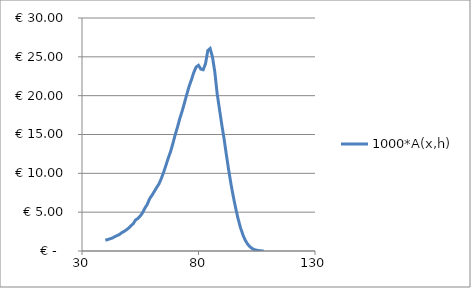
| Category | 1000*A(x,h) |
|---|---|
| 40.0 | 1.397 |
| 41.0 | 1.464 |
| 42.0 | 1.569 |
| 43.0 | 1.673 |
| 44.0 | 1.832 |
| 45.0 | 1.979 |
| 46.0 | 2.113 |
| 47.0 | 2.349 |
| 48.0 | 2.514 |
| 49.0 | 2.713 |
| 50.0 | 2.945 |
| 51.0 | 3.236 |
| 52.0 | 3.52 |
| 53.0 | 3.996 |
| 54.0 | 4.187 |
| 55.0 | 4.506 |
| 56.0 | 4.931 |
| 57.0 | 5.528 |
| 58.0 | 6.002 |
| 59.0 | 6.719 |
| 60.0 | 7.154 |
| 61.0 | 7.645 |
| 62.0 | 8.16 |
| 63.0 | 8.614 |
| 64.0 | 9.3 |
| 65.0 | 10.106 |
| 66.0 | 11.014 |
| 67.0 | 11.949 |
| 68.0 | 12.78 |
| 69.0 | 13.831 |
| 70.0 | 14.972 |
| 71.0 | 15.97 |
| 72.0 | 17.088 |
| 73.0 | 18.02 |
| 74.0 | 19.092 |
| 75.0 | 20.191 |
| 76.0 | 21.232 |
| 77.0 | 22.073 |
| 78.0 | 23.007 |
| 79.0 | 23.692 |
| 80.0 | 23.91 |
| 81.0 | 23.422 |
| 82.0 | 23.338 |
| 83.0 | 24.097 |
| 84.0 | 25.814 |
| 85.0 | 26.073 |
| 86.0 | 24.969 |
| 87.0 | 23.061 |
| 88.0 | 20.284 |
| 89.0 | 18.248 |
| 90.0 | 16.251 |
| 91.0 | 14.39 |
| 92.0 | 12.314 |
| 93.0 | 10.339 |
| 94.0 | 8.532 |
| 95.0 | 6.908 |
| 96.0 | 5.461 |
| 97.0 | 4.135 |
| 98.0 | 3.018 |
| 99.0 | 2.12 |
| 100.0 | 1.42 |
| 101.0 | 0.917 |
| 102.0 | 0.567 |
| 103.0 | 0.327 |
| 104.0 | 0.178 |
| 105.0 | 0.091 |
| 106.0 | 0.048 |
| 107.0 | 0.016 |
| 108.0 | 0.01 |